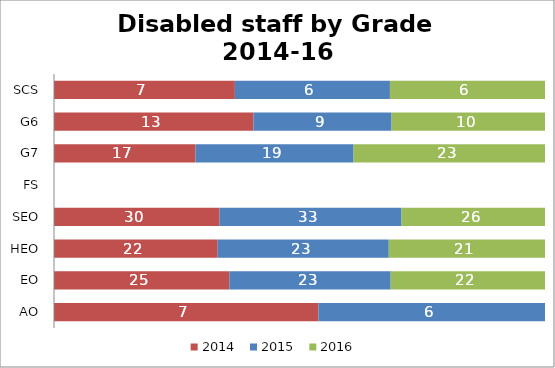
| Category | 2014 | 2015 | 2016 |
|---|---|---|---|
| AO | 7 | 6 | 0 |
| EO | 25 | 23 | 22 |
| HEO | 22 | 23 | 21 |
| SEO | 30 | 33 | 26 |
| FS | 0 | 0 | 0 |
| G7 | 17 | 19 | 23 |
| G6 | 13 | 9 | 10 |
| SCS | 7 | 6 | 6 |